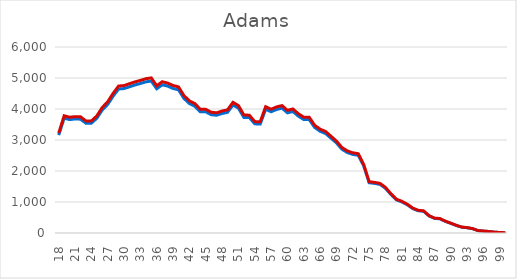
| Category | Series 0 | Adams |
|---|---|---|
| 18.0 | 3157.671 | 3223 |
| 19.0 | 3705.34 | 3782 |
| 20.0 | 3658.313 | 3734 |
| 21.0 | 3677.908 | 3754 |
| 22.0 | 3672.03 | 3748 |
| 23.0 | 3540.746 | 3614 |
| 24.0 | 3542.705 | 3616 |
| 25.0 | 3701.421 | 3778 |
| 26.0 | 3968.888 | 4051 |
| 27.0 | 4149.158 | 4235 |
| 28.0 | 4417.604 | 4509 |
| 29.0 | 4644.902 | 4741 |
| 30.0 | 4659.598 | 4756 |
| 31.0 | 4717.402 | 4815 |
| 32.0 | 4775.206 | 4874 |
| 33.0 | 4823.213 | 4923 |
| 34.0 | 4876.118 | 4977 |
| 35.0 | 4900.612 | 5002 |
| 36.0 | 4651.76 | 4748 |
| 37.0 | 4781.084 | 4880 |
| 38.0 | 4738.956 | 4837 |
| 39.0 | 4661.557 | 4758 |
| 40.0 | 4617.469 | 4713 |
| 41.0 | 4340.206 | 4430 |
| 42.0 | 4175.611 | 4262 |
| 43.0 | 4087.435 | 4172 |
| 44.0 | 3911.084 | 3992 |
| 45.0 | 3908.145 | 3989 |
| 46.0 | 3816.05 | 3895 |
| 47.0 | 3798.415 | 3877 |
| 48.0 | 3855.239 | 3935 |
| 49.0 | 3893.449 | 3974 |
| 50.0 | 4129.564 | 4215 |
| 51.0 | 4026.692 | 4110 |
| 52.0 | 3728.854 | 3806 |
| 53.0 | 3723.955 | 3801 |
| 54.0 | 3521.151 | 3594 |
| 55.0 | 3515.273 | 3588 |
| 56.0 | 3991.422 | 4074 |
| 57.0 | 3911.084 | 3992 |
| 58.0 | 3984.564 | 4067 |
| 59.0 | 4026.692 | 4110 |
| 60.0 | 3876.793 | 3957 |
| 61.0 | 3919.901 | 4001 |
| 62.0 | 3770.003 | 3848 |
| 63.0 | 3659.293 | 3735 |
| 64.0 | 3657.334 | 3733 |
| 65.0 | 3404.563 | 3475 |
| 66.0 | 3281.117 | 3349 |
| 67.0 | 3209.597 | 3276 |
| 68.0 | 3057.739 | 3121 |
| 69.0 | 2904.901 | 2965 |
| 70.0 | 2702.096 | 2758 |
| 71.0 | 2593.346 | 2647 |
| 72.0 | 2535.542 | 2588 |
| 73.0 | 2506.15 | 2558 |
| 74.0 | 2167.164 | 2212 |
| 75.0 | 1621.454 | 1655 |
| 76.0 | 1599.9 | 1633 |
| 77.0 | 1567.569 | 1600 |
| 78.0 | 1441.183 | 1471 |
| 79.0 | 1241.318 | 1267 |
| 80.0 | 1068.886 | 1091 |
| 81.0 | 1003.244 | 1024 |
| 82.0 | 911.149 | 930 |
| 83.0 | 788.683 | 805 |
| 84.0 | 718.142 | 733 |
| 85.0 | 700.507 | 715 |
| 86.0 | 549.629 | 561 |
| 87.0 | 471.25 | 481 |
| 88.0 | 457.534 | 467 |
| 89.0 | 374.257 | 382 |
| 90.0 | 310.575 | 317 |
| 91.0 | 242.973 | 248 |
| 92.0 | 188.108 | 192 |
| 93.0 | 169.493 | 173 |
| 94.0 | 139.122 | 142 |
| 95.0 | 76.419 | 78 |
| 96.0 | 61.723 | 63 |
| 97.0 | 48.007 | 49 |
| 98.0 | 27.432 | 28 |
| 99.0 | 15.676 | 16 |
| 100.0 | 8.818 | 9 |